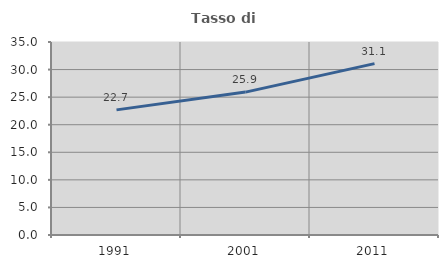
| Category | Tasso di occupazione   |
|---|---|
| 1991.0 | 22.691 |
| 2001.0 | 25.915 |
| 2011.0 | 31.08 |